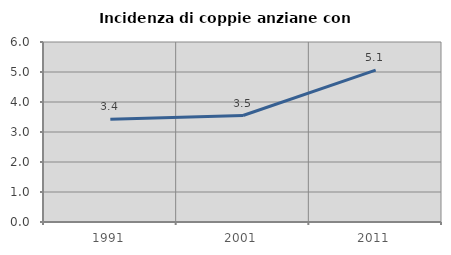
| Category | Incidenza di coppie anziane con figli |
|---|---|
| 1991.0 | 3.429 |
| 2001.0 | 3.549 |
| 2011.0 | 5.061 |